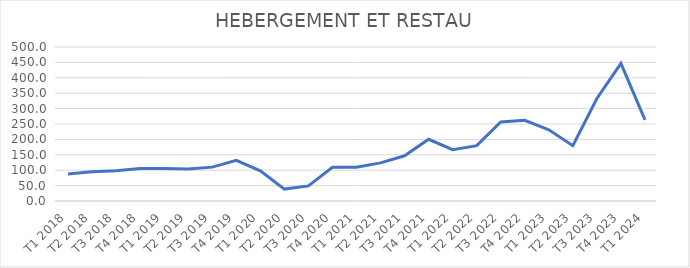
| Category | Series 0 |
|---|---|
| T1 2018 | 87.694 |
| T2 2018 | 95.018 |
| T3 2018 | 97.934 |
| T4 2018 | 105.774 |
| T1 2019 | 105.789 |
| T2 2019 | 103.624 |
| T3 2019 | 109.984 |
| T4 2019 | 131.892 |
| T1 2020 | 98.044 |
| T2 2020 | 38.642 |
| T3 2020 | 48.897 |
| T4 2020 | 109.434 |
| T1 2021 | 109.471 |
| T2 2021 | 123.78 |
| T3 2021 | 146.824 |
| T4 2021 | 200.421 |
| T1 2022 | 166.779 |
| T2 2022 | 179.721 |
| T3 2022 | 256.478 |
| T4 2022 | 262.227 |
| T1 2023 | 231.201 |
| T2 2023 | 179.721 |
| T3 2023 | 332.959 |
| T4 2023 | 446.87 |
| T1 2024 | 263.405 |